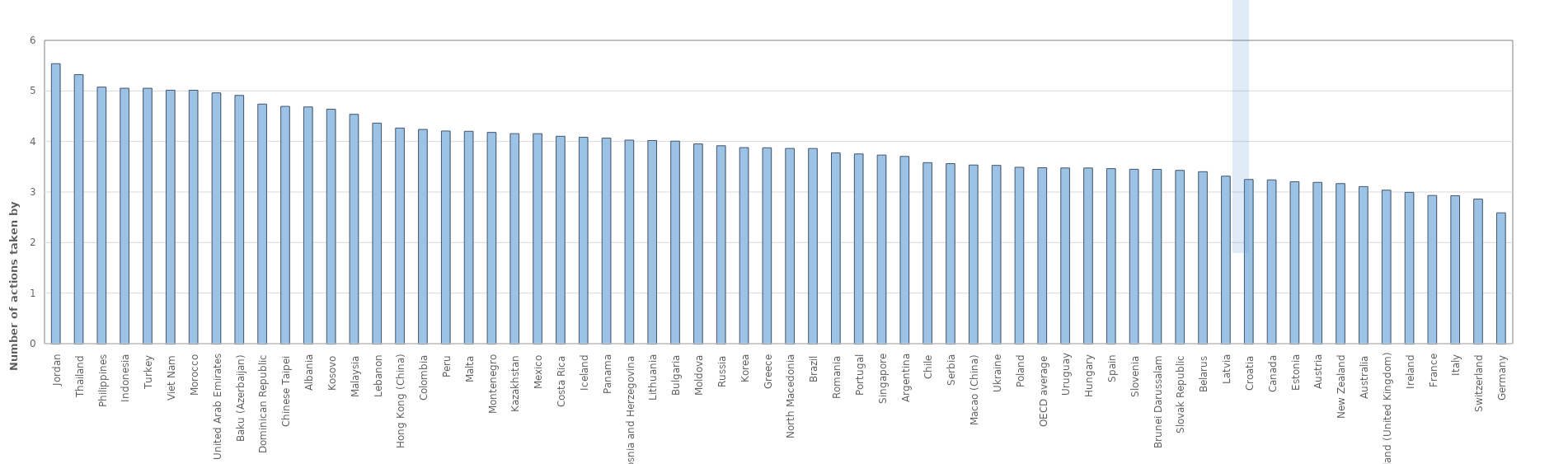
| Category | Mean |
|---|---|
| Jordan | 5.539 |
| Thailand | 5.322 |
| Philippines | 5.076 |
| Indonesia | 5.053 |
| Turkey | 5.053 |
| Viet Nam | 5.015 |
| Morocco | 5.014 |
| United Arab Emirates | 4.961 |
| Baku (Azerbaijan) | 4.911 |
| Dominican Republic | 4.74 |
| Chinese Taipei | 4.695 |
| Albania | 4.684 |
| Kosovo | 4.639 |
| Malaysia | 4.537 |
| Lebanon | 4.364 |
| Hong Kong (China) | 4.266 |
| Colombia | 4.239 |
| Peru | 4.208 |
| Malta | 4.202 |
| Montenegro | 4.18 |
| Kazakhstan | 4.155 |
| Mexico | 4.155 |
| Costa Rica | 4.103 |
| Iceland | 4.083 |
| Panama | 4.066 |
| Bosnia and Herzegovina | 4.027 |
| Lithuania | 4.019 |
| Bulgaria | 4.007 |
| Moldova | 3.951 |
| Russia | 3.916 |
| Korea | 3.879 |
| Greece | 3.875 |
| North Macedonia | 3.862 |
| Brazil | 3.862 |
| Romania | 3.774 |
| Portugal | 3.754 |
| Singapore | 3.732 |
| Argentina | 3.705 |
| Chile | 3.582 |
| Serbia | 3.561 |
| Macao (China) | 3.534 |
| Ukraine | 3.527 |
| Poland | 3.489 |
| OECD average | 3.481 |
| Uruguay | 3.476 |
| Hungary | 3.475 |
| Spain | 3.463 |
| Slovenia | 3.45 |
| Brunei Darussalam | 3.448 |
| Slovak Republic | 3.428 |
| Belarus | 3.402 |
| Latvia | 3.314 |
| Croatia | 3.249 |
| Canada | 3.24 |
| Estonia | 3.204 |
| Austria | 3.191 |
| New Zealand | 3.167 |
| Australia | 3.108 |
| Scotland (United Kingdom) | 3.037 |
| Ireland | 2.993 |
| France | 2.932 |
| Italy | 2.928 |
| Switzerland | 2.859 |
| Germany | 2.589 |